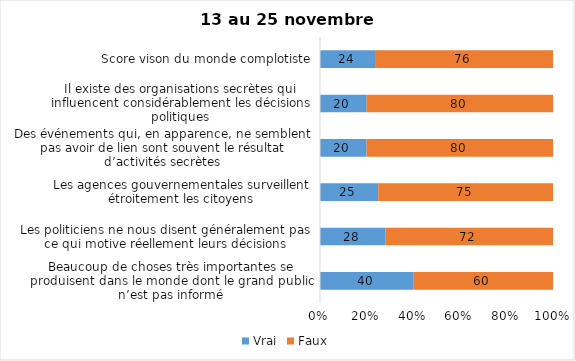
| Category | Vrai | Faux |
|---|---|---|
| Beaucoup de choses très importantes se produisent dans le monde dont le grand public n’est pas informé | 40 | 60 |
| Les politiciens ne nous disent généralement pas ce qui motive réellement leurs décisions | 28 | 72 |
| Les agences gouvernementales surveillent étroitement les citoyens | 25 | 75 |
| Des événements qui, en apparence, ne semblent pas avoir de lien sont souvent le résultat d’activités secrètes | 20 | 80 |
| Il existe des organisations secrètes qui influencent considérablement les décisions politiques | 20 | 80 |
| Score vison du monde complotiste | 24 | 76 |